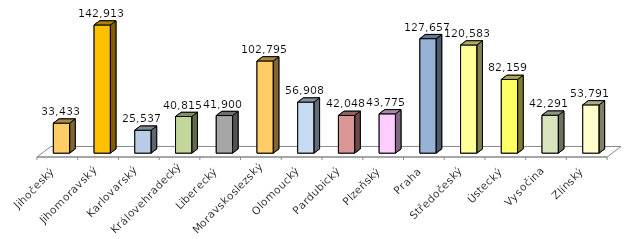
| Category | Series 0 |
|---|---|
| Jihočeský | 33433.468 |
| Jihomoravský | 142912.6 |
| Karlovarský | 25537.4 |
| Královehradecký | 40815.3 |
| Liberecký | 41899.9 |
| Moravskoslezský | 102795.428 |
| Olomoucký | 56908 |
| Pardubický | 42047.6 |
| Plzeňský | 43774.5 |
| Praha | 127657.151 |
| Středočeský | 120583.11 |
| Ústecký | 82159.227 |
| Vysočina | 42290.824 |
| Zlínský | 53791.1 |